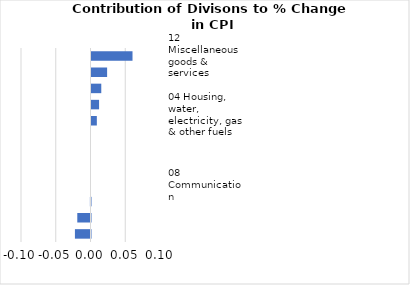
| Category |     Contributions |
|---|---|
| 12 Miscellaneous goods & services | 0.059 |
| 07 Transport | 0.022 |
| 02 Alcoholic beverages, tobacco & narcotics | 0.014 |
| 03 Clothing and footwear | 0.011 |
| 04 Housing, water, electricity, gas & other fuels | 0.008 |
| 09 Recreation and culture | 0 |
| 11 Restaurants and hotels | 0 |
| 10 Education | 0 |
| 08 Communication | 0 |
| 05 Furnishings, household equipment & maintenance | -0.001 |
| 06 Health | -0.019 |
| 01 Food and non-alcoholic beverages | -0.022 |